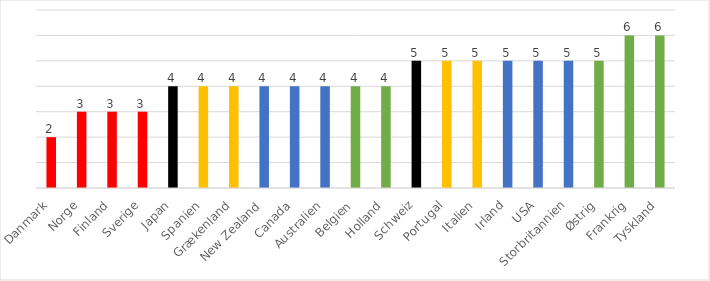
| Category | Series 0 |
|---|---|
| Danmark | 2 |
| Norge | 3 |
| Finland | 3 |
| Sverige | 3 |
| Japan | 4 |
| Spanien | 4 |
| Grækenland | 4 |
| New Zealand | 4 |
| Canada | 4 |
| Australien | 4 |
| Belgien | 4 |
| Holland | 4 |
| Schweiz | 5 |
| Portugal | 5 |
| Italien | 5 |
| Irland | 5 |
| USA | 5 |
| Storbritannien | 5 |
| Østrig | 5 |
| Frankrig | 6 |
| Tyskland | 6 |